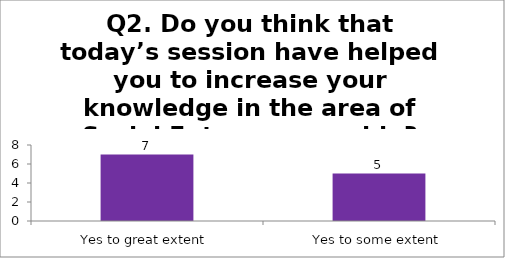
| Category | Q2. Do you think that today’s session have helped you to increase your knowledge in the area of Social Entrepreneurship? |
|---|---|
| Yes to great extent | 7 |
| Yes to some extent | 5 |